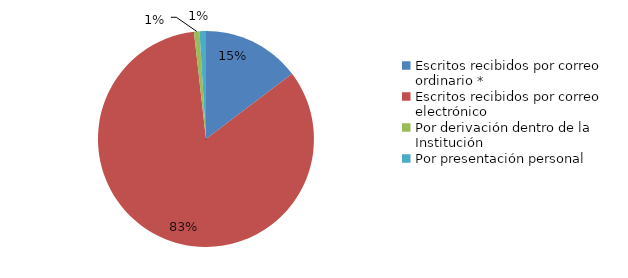
| Category | Series 0 |
|---|---|
| Escritos recibidos por correo ordinario * | 107 |
| Escritos recibidos por correo electrónico | 609 |
| Por derivación dentro de la Institución | 6 |
| Por FAX | 0 |
| Por presentación personal | 7 |